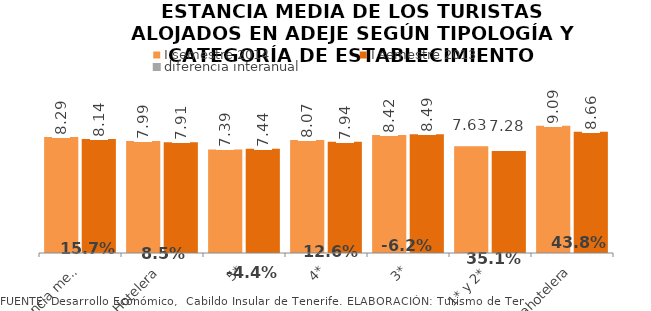
| Category | I semestre 2014 | I semestre 2013 |
|---|---|---|
| Estancia media total | 8.294 | 8.137 |
| Hotelera | 7.994 | 7.909 |
| 5* | 7.395 | 7.439 |
| 4* | 8.069 | 7.943 |
| 3* | 8.423 | 8.486 |
| 1* y 2* | 7.63 | 7.279 |
| Extrahotelera | 9.095 | 8.657 |